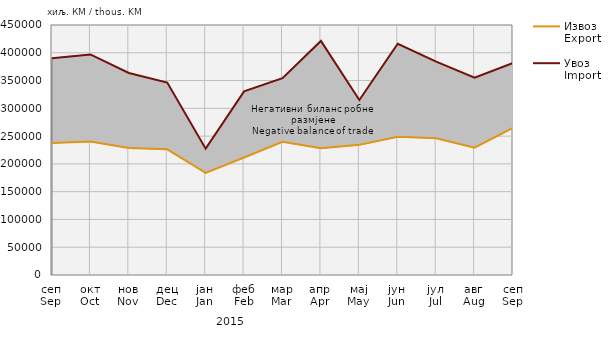
| Category | Извоз
Export | Увоз
Import |
|---|---|---|
| сеп
Sep | 237597 | 390273 |
| окт
Oct | 240258 | 396961 |
| нов
Nov | 228539 | 363606 |
| дец
Dec | 226207 | 346357 |
| јан
Jan | 183779 | 227458 |
| феб
Feb | 211524 | 330459 |
| мар
Mar | 239782 | 354355 |
| апр
Apr | 228100 | 421365 |
| мај
May | 234236 | 315075 |
| јун
Jun | 248861 | 416233 |
| јул
Jul | 245938 | 384144 |
| авг
Aug | 229236 | 355008 |
| сеп
Sep | 264900 | 381709 |